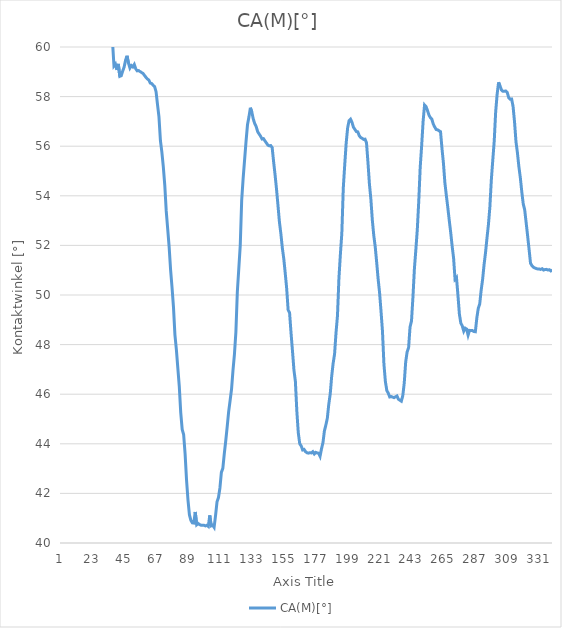
| Category | CA(M)[°] |
|---|---|
| 0 | 62.673 |
| 1 | 62.571 |
| 2 | 62.561 |
| 3 | 62.597 |
| 4 | 62.485 |
| 5 | 62.443 |
| 6 | 62.158 |
| 7 | 63.045 |
| 8 | 63.911 |
| 9 | 66.204 |
| 10 | 65.804 |
| 11 | 65.942 |
| 12 | 63.903 |
| 13 | 63.544 |
| 14 | 63.227 |
| 15 | 63.643 |
| 16 | 62.956 |
| 17 | 63.214 |
| 18 | 63.53 |
| 19 | 64.171 |
| 20 | 64.616 |
| 21 | 65.644 |
| 22 | 66.206 |
| 23 | 67.258 |
| 24 | 67.488 |
| 25 | 68.1 |
| 26 | 69.83 |
| 27 | 74.993 |
| 28 | 76.569 |
| 29 | 75.402 |
| 30 | 70.569 |
| 31 | 66.893 |
| 32 | 66.156 |
| 33 | 65.149 |
| 34 | 61.656 |
| 35 | 60.206 |
| 36 | 59.238 |
| 37 | 59.314 |
| 38 | 59.082 |
| 39 | 59.319 |
| 40 | 58.817 |
| 41 | 58.841 |
| 42 | 59.027 |
| 43 | 59.189 |
| 44 | 59.471 |
| 45 | 59.646 |
| 46 | 59.345 |
| 47 | 59.151 |
| 48 | 59.251 |
| 49 | 59.2 |
| 50 | 59.295 |
| 51 | 59.121 |
| 52 | 59.041 |
| 53 | 59.05 |
| 54 | 59.008 |
| 55 | 58.97 |
| 56 | 58.938 |
| 57 | 58.859 |
| 58 | 58.78 |
| 59 | 58.713 |
| 60 | 58.671 |
| 61 | 58.546 |
| 62 | 58.525 |
| 63 | 58.456 |
| 64 | 58.403 |
| 65 | 58.199 |
| 66 | 57.676 |
| 67 | 57.182 |
| 68 | 56.23 |
| 69 | 55.759 |
| 70 | 55.167 |
| 71 | 54.435 |
| 72 | 53.389 |
| 73 | 52.68 |
| 74 | 51.95 |
| 75 | 51.025 |
| 76 | 50.312 |
| 77 | 49.507 |
| 78 | 48.396 |
| 79 | 47.794 |
| 80 | 47.052 |
| 81 | 46.312 |
| 82 | 45.26 |
| 83 | 44.577 |
| 84 | 44.377 |
| 85 | 43.6 |
| 86 | 42.539 |
| 87 | 41.732 |
| 88 | 41.132 |
| 89 | 40.915 |
| 90 | 40.815 |
| 91 | 40.806 |
| 92 | 41.252 |
| 93 | 40.736 |
| 94 | 40.787 |
| 95 | 40.742 |
| 96 | 40.718 |
| 97 | 40.721 |
| 98 | 40.716 |
| 99 | 40.69 |
| 100 | 40.716 |
| 101 | 40.669 |
| 102 | 41.114 |
| 103 | 40.69 |
| 104 | 40.718 |
| 105 | 40.629 |
| 106 | 41.111 |
| 107 | 41.659 |
| 108 | 41.831 |
| 109 | 42.218 |
| 110 | 42.846 |
| 111 | 43.012 |
| 112 | 43.592 |
| 113 | 44.112 |
| 114 | 44.685 |
| 115 | 45.29 |
| 116 | 45.735 |
| 117 | 46.199 |
| 118 | 46.957 |
| 119 | 47.608 |
| 120 | 48.504 |
| 121 | 50.131 |
| 122 | 51.058 |
| 123 | 51.991 |
| 124 | 53.827 |
| 125 | 54.699 |
| 126 | 55.452 |
| 127 | 56.191 |
| 128 | 56.864 |
| 129 | 57.182 |
| 130 | 57.552 |
| 131 | 57.368 |
| 132 | 57.092 |
| 133 | 56.913 |
| 134 | 56.787 |
| 135 | 56.588 |
| 136 | 56.492 |
| 137 | 56.406 |
| 138 | 56.29 |
| 139 | 56.307 |
| 140 | 56.218 |
| 141 | 56.132 |
| 142 | 56.047 |
| 143 | 56.014 |
| 144 | 56.026 |
| 145 | 55.944 |
| 146 | 55.372 |
| 147 | 54.847 |
| 148 | 54.267 |
| 149 | 53.615 |
| 150 | 52.945 |
| 151 | 52.469 |
| 152 | 51.898 |
| 153 | 51.465 |
| 154 | 50.881 |
| 155 | 50.261 |
| 156 | 49.395 |
| 157 | 49.28 |
| 158 | 48.468 |
| 159 | 47.739 |
| 160 | 46.976 |
| 161 | 46.512 |
| 162 | 45.313 |
| 163 | 44.443 |
| 164 | 44.003 |
| 165 | 43.915 |
| 166 | 43.751 |
| 167 | 43.773 |
| 168 | 43.681 |
| 169 | 43.639 |
| 170 | 43.624 |
| 171 | 43.641 |
| 172 | 43.633 |
| 173 | 43.681 |
| 174 | 43.591 |
| 175 | 43.654 |
| 176 | 43.632 |
| 177 | 43.623 |
| 178 | 43.498 |
| 179 | 43.8 |
| 180 | 44.049 |
| 181 | 44.521 |
| 182 | 44.758 |
| 183 | 45.028 |
| 184 | 45.59 |
| 185 | 46.008 |
| 186 | 46.712 |
| 187 | 47.242 |
| 188 | 47.618 |
| 189 | 48.481 |
| 190 | 49.167 |
| 191 | 50.674 |
| 192 | 51.638 |
| 193 | 52.488 |
| 194 | 54.308 |
| 195 | 55.252 |
| 196 | 56.127 |
| 197 | 56.738 |
| 198 | 57.029 |
| 199 | 57.09 |
| 200 | 56.964 |
| 201 | 56.765 |
| 202 | 56.678 |
| 203 | 56.59 |
| 204 | 56.579 |
| 205 | 56.424 |
| 206 | 56.349 |
| 207 | 56.317 |
| 208 | 56.275 |
| 209 | 56.284 |
| 210 | 56.135 |
| 211 | 55.354 |
| 212 | 54.485 |
| 213 | 53.873 |
| 214 | 53.032 |
| 215 | 52.405 |
| 216 | 51.947 |
| 217 | 51.323 |
| 218 | 50.652 |
| 219 | 50.098 |
| 220 | 49.347 |
| 221 | 48.541 |
| 222 | 47.219 |
| 223 | 46.516 |
| 224 | 46.149 |
| 225 | 46.041 |
| 226 | 45.889 |
| 227 | 45.906 |
| 228 | 45.882 |
| 229 | 45.861 |
| 230 | 45.897 |
| 231 | 45.927 |
| 232 | 45.796 |
| 233 | 45.757 |
| 234 | 45.719 |
| 235 | 45.939 |
| 236 | 46.449 |
| 237 | 47.299 |
| 238 | 47.708 |
| 239 | 47.875 |
| 240 | 48.712 |
| 241 | 48.95 |
| 242 | 49.916 |
| 243 | 51.054 |
| 244 | 51.823 |
| 245 | 52.644 |
| 246 | 53.777 |
| 247 | 55.146 |
| 248 | 56.017 |
| 249 | 57 |
| 250 | 57.662 |
| 251 | 57.6 |
| 252 | 57.445 |
| 253 | 57.261 |
| 254 | 57.152 |
| 255 | 57.092 |
| 256 | 56.894 |
| 257 | 56.774 |
| 258 | 56.674 |
| 259 | 56.66 |
| 260 | 56.621 |
| 261 | 56.586 |
| 262 | 55.911 |
| 263 | 55.321 |
| 264 | 54.535 |
| 265 | 54.014 |
| 266 | 53.54 |
| 267 | 53.016 |
| 268 | 52.53 |
| 269 | 51.973 |
| 270 | 51.491 |
| 271 | 50.635 |
| 272 | 50.703 |
| 273 | 49.994 |
| 274 | 49.231 |
| 275 | 48.863 |
| 276 | 48.75 |
| 277 | 48.544 |
| 278 | 48.663 |
| 279 | 48.627 |
| 280 | 48.381 |
| 281 | 48.573 |
| 282 | 48.569 |
| 283 | 48.566 |
| 284 | 48.527 |
| 285 | 48.519 |
| 286 | 49.068 |
| 287 | 49.459 |
| 288 | 49.634 |
| 289 | 50.192 |
| 290 | 50.626 |
| 291 | 51.22 |
| 292 | 51.702 |
| 293 | 52.285 |
| 294 | 52.833 |
| 295 | 53.544 |
| 296 | 54.631 |
| 297 | 55.434 |
| 298 | 56.206 |
| 299 | 57.384 |
| 300 | 58.088 |
| 301 | 58.575 |
| 302 | 58.431 |
| 303 | 58.264 |
| 304 | 58.214 |
| 305 | 58.22 |
| 306 | 58.224 |
| 307 | 58.16 |
| 308 | 57.954 |
| 309 | 57.896 |
| 310 | 57.901 |
| 311 | 57.597 |
| 312 | 56.977 |
| 313 | 56.179 |
| 314 | 55.728 |
| 315 | 55.172 |
| 316 | 54.726 |
| 317 | 54.158 |
| 318 | 53.669 |
| 319 | 53.434 |
| 320 | 52.917 |
| 321 | 52.392 |
| 322 | 51.85 |
| 323 | 51.283 |
| 324 | 51.182 |
| 325 | 51.118 |
| 326 | 51.088 |
| 327 | 51.067 |
| 328 | 51.049 |
| 329 | 51.052 |
| 330 | 51.032 |
| 331 | 51.061 |
| 332 | 51.007 |
| 333 | 51.027 |
| 334 | 51.034 |
| 335 | 51.007 |
| 336 | 51.02 |
| 337 | 50.972 |
| 338 | 51.011 |